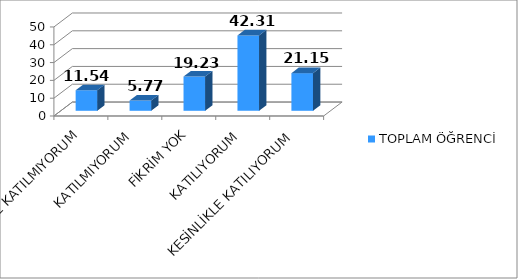
| Category | TOPLAM ÖĞRENCİ |
|---|---|
| KESİNLİKLE KATILMIYORUM | 11.54 |
| KATILMIYORUM | 5.77 |
| FİKRİM YOK | 19.23 |
| KATILIYORUM | 42.31 |
| KESİNLİKLE KATILIYORUM | 21.15 |